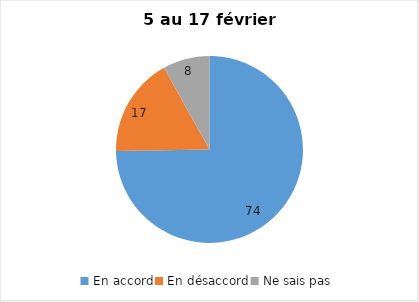
| Category | Series 0 |
|---|---|
| En accord | 74 |
| En désaccord | 17 |
| Ne sais pas | 8 |